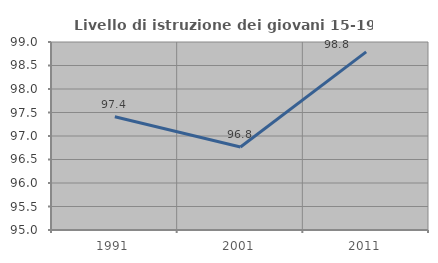
| Category | Livello di istruzione dei giovani 15-19 anni |
|---|---|
| 1991.0 | 97.411 |
| 2001.0 | 96.765 |
| 2011.0 | 98.789 |